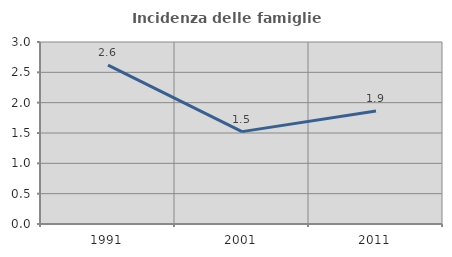
| Category | Incidenza delle famiglie numerose |
|---|---|
| 1991.0 | 2.62 |
| 2001.0 | 1.523 |
| 2011.0 | 1.863 |